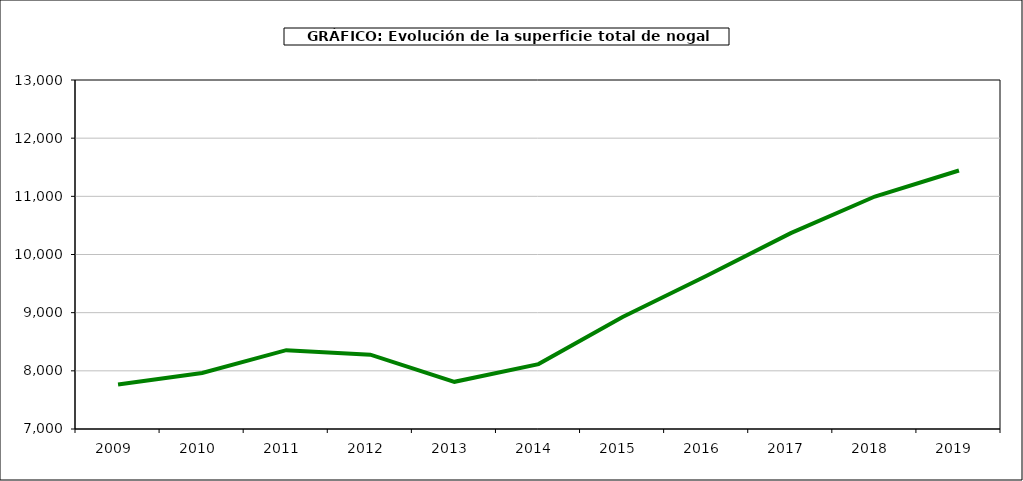
| Category | superficie nogal |
|---|---|
| 2009.0 | 7765 |
| 2010.0 | 7962 |
| 2011.0 | 8355 |
| 2012.0 | 8278 |
| 2013.0 | 7811 |
| 2014.0 | 8116 |
| 2015.0 | 8926 |
| 2016.0 | 9634 |
| 2017.0 | 10367 |
| 2018.0 | 10997 |
| 2019.0 | 11444 |